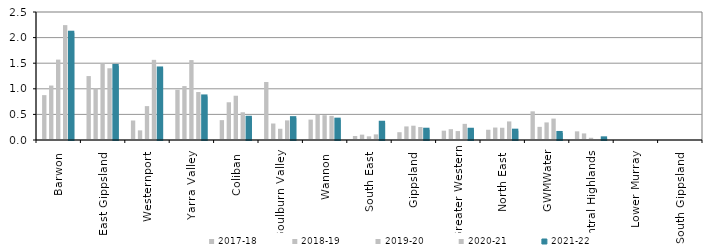
| Category | 2017-18 | 2018-19 | 2019-20 | 2020-21 | 2021-22 |
|---|---|---|---|---|---|
| Barwon  | 0.876 | 1.064 | 1.57 | 2.244 | 2.095 |
| East Gippsland  | 1.249 | 1.01 | 1.494 | 1.401 | 1.447 |
| Westernport  | 0.381 | 0.189 | 0.662 | 1.566 | 1.397 |
| Yarra Valley  | 0.981 | 1.053 | 1.561 | 0.937 | 0.851 |
| Coliban  | 0.388 | 0.737 | 0.864 | 0.542 | 0.434 |
| Goulburn Valley  | 1.133 | 0.322 | 0.219 | 0.383 | 0.427 |
| Wannon  | 0.398 | 0.499 | 0.484 | 0.471 | 0.398 |
| South East  | 0.078 | 0.105 | 0.071 | 0.11 | 0.337 |
| Gippsland  | 0.152 | 0.265 | 0.279 | 0.253 | 0.201 |
| Greater Western | 0.182 | 0.211 | 0.174 | 0.315 | 0.2 |
| North East  | 0.2 | 0.243 | 0.239 | 0.363 | 0.182 |
| GWMWater | 0.56 | 0.257 | 0.343 | 0.418 | 0.137 |
| Central Highlands  | 0.169 | 0.129 | 0.044 | 0.016 | 0.033 |
| Lower Murray  | 0 | 0 | 0.007 | 0.003 | 0 |
| South Gippsland  | 0 | 0.006 | 0 | 0.006 | 0 |